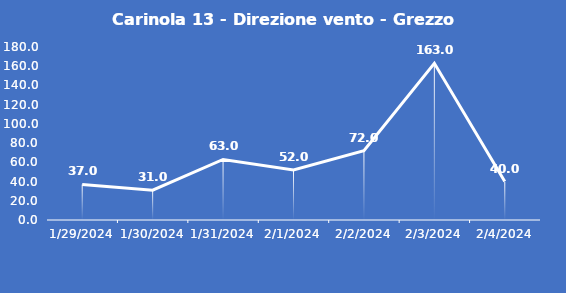
| Category | Carinola 13 - Direzione vento - Grezzo (°N) |
|---|---|
| 1/29/24 | 37 |
| 1/30/24 | 31 |
| 1/31/24 | 63 |
| 2/1/24 | 52 |
| 2/2/24 | 72 |
| 2/3/24 | 163 |
| 2/4/24 | 40 |